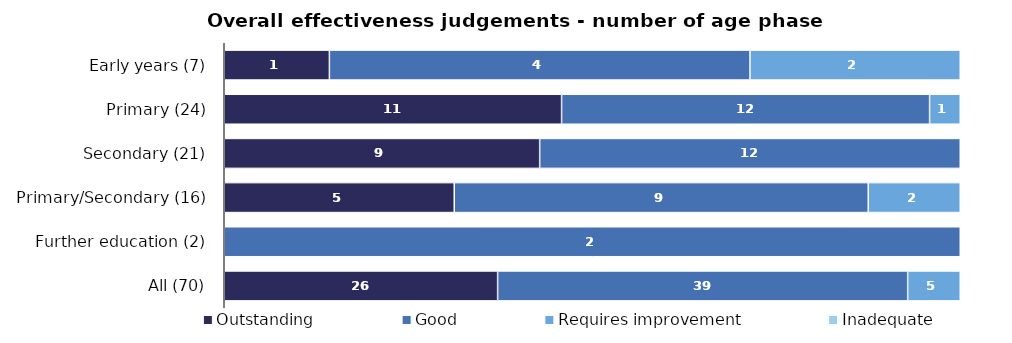
| Category | Outstanding | Good | Requires improvement | Inadequate |
|---|---|---|---|---|
| Early years (7) | 1 | 4 | 2 | 0 |
| Primary (24) | 11 | 12 | 1 | 0 |
| Secondary (21) | 9 | 12 | 0 | 0 |
| Primary/Secondary (16) | 5 | 9 | 2 | 0 |
| Further education (2) | 0 | 2 | 0 | 0 |
| All (70) | 26 | 39 | 5 | 0 |